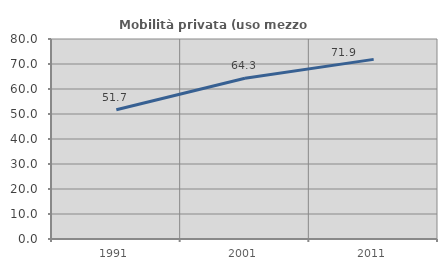
| Category | Mobilità privata (uso mezzo privato) |
|---|---|
| 1991.0 | 51.717 |
| 2001.0 | 64.273 |
| 2011.0 | 71.855 |